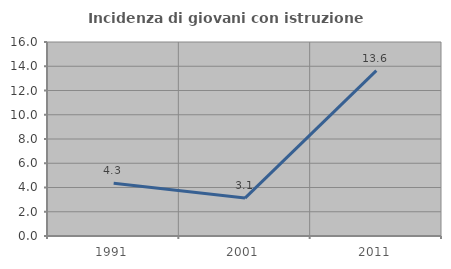
| Category | Incidenza di giovani con istruzione universitaria |
|---|---|
| 1991.0 | 4.348 |
| 2001.0 | 3.125 |
| 2011.0 | 13.636 |